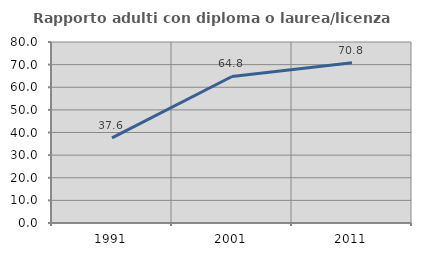
| Category | Rapporto adulti con diploma o laurea/licenza media  |
|---|---|
| 1991.0 | 37.643 |
| 2001.0 | 64.756 |
| 2011.0 | 70.792 |